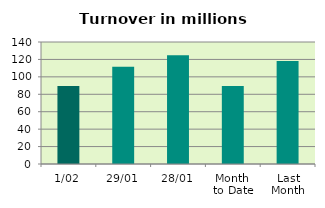
| Category | Series 0 |
|---|---|
| 1/02 | 89.509 |
| 29/01 | 111.738 |
| 28/01 | 124.743 |
| Month 
to Date | 89.509 |
| Last
Month | 118.136 |